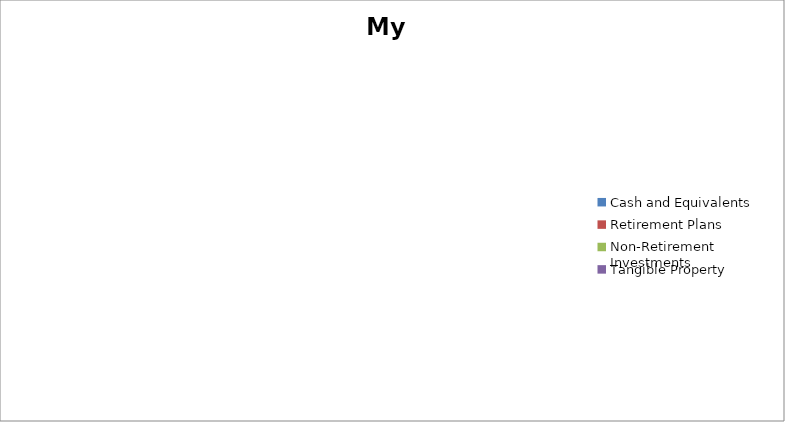
| Category | My Assets |
|---|---|
| Cash and Equivalents | 0 |
| Retirement Plans | 0 |
| Non-Retirement Investments | 0 |
| Tangible Property | 0 |